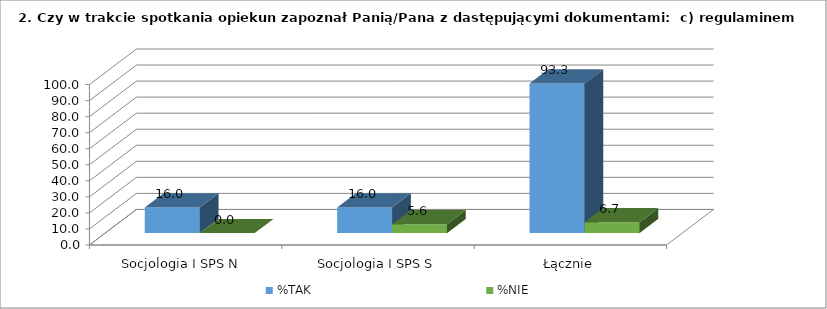
| Category | %TAK | %NIE |
|---|---|---|
| Socjologia I SPS N  | 16 | 0 |
| Socjologia I SPS S | 16 | 5.556 |
| Łącznie | 93.258 | 6.742 |